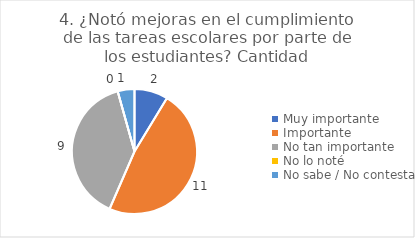
| Category | 4. ¿Notó mejoras en el cumplimiento de las tareas escolares por parte de los estudiantes? |
|---|---|
| Muy importante  | 0.087 |
| Importante  | 0.478 |
| No tan importante  | 0.391 |
| No lo noté  | 0 |
| No sabe / No contesta | 0.043 |